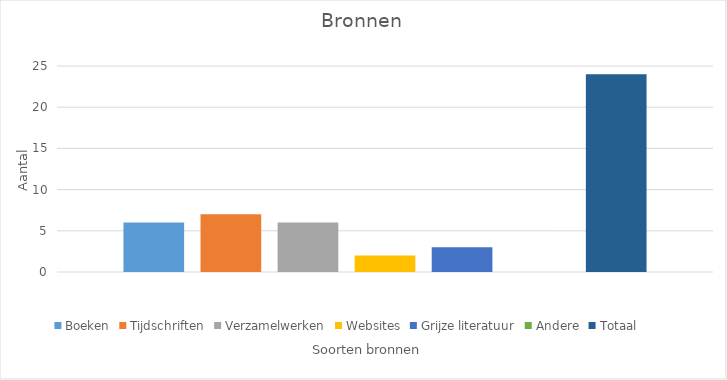
| Category | Boeken | Tijdschriften | Verzamelwerken | Websites | Grijze literatuur | Andere | Totaal |
|---|---|---|---|---|---|---|---|
| Aantal | 6 | 7 | 6 | 2 | 3 | 0 | 24 |